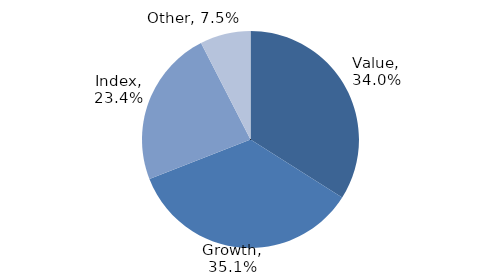
| Category | Investment Style |
|---|---|
| Value | 0.34 |
| Growth | 0.351 |
| Index | 0.234 |
| Other | 0.075 |